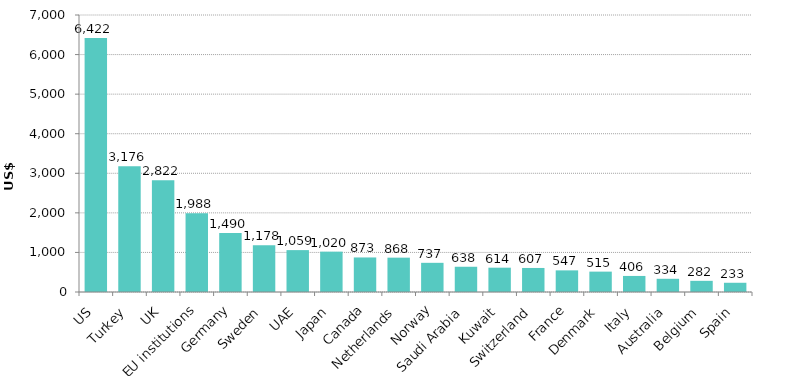
| Category | Series 0 |
|---|---|
| US | 6421.868 |
| Turkey | 3176.3 |
| UK | 2822.29 |
| EU institutions | 1987.575 |
| Germany | 1490.48 |
| Sweden | 1178.276 |
| UAE | 1058.57 |
| Japan | 1019.762 |
| Canada | 873.057 |
| Netherlands | 867.851 |
| Norway | 737.239 |
| Saudi Arabia | 637.838 |
| Kuwait | 614.412 |
| Switzerland | 607.462 |
| France | 546.656 |
| Denmark | 514.897 |
| Italy | 405.63 |
| Australia | 333.798 |
| Belgium | 282.155 |
| Spain | 233.27 |